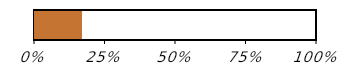
| Category | Перебіг придбання: (1 з 6) |
|---|---|
| Придбано | 0.167 |